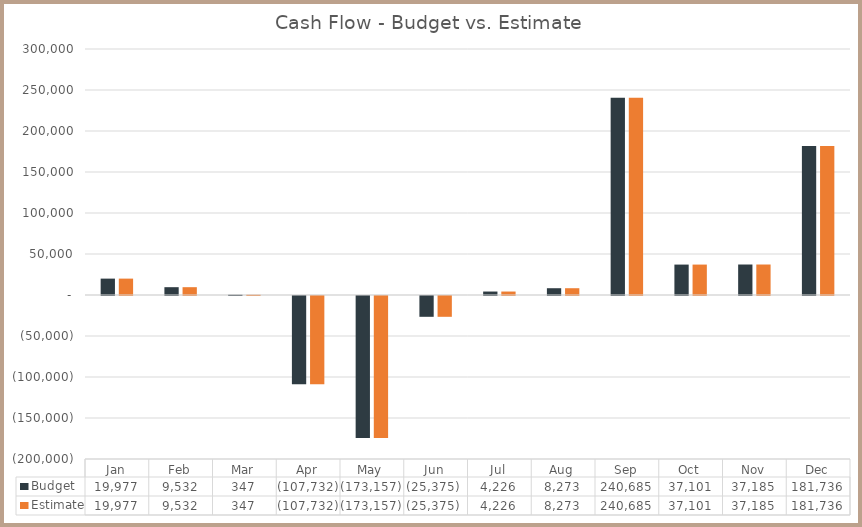
| Category | Budget | Estimate |
|---|---|---|
| Jan | 19977.169 | 19977.169 |
| Feb | 9532.433 | 9532.433 |
| Mar | 346.788 | 346.788 |
| Apr | -107731.546 | -107731.546 |
| May | -173157.157 | -173157.157 |
| Jun | -25375.394 | -25375.394 |
| Jul | 4226.285 | 4226.285 |
| Aug | 8273.24 | 8273.24 |
| Sep | 240685.083 | 240685.083 |
| Oct | 37100.704 | 37100.704 |
| Nov | 37184.715 | 37184.715 |
| Dec | 181736.339 | 181736.339 |